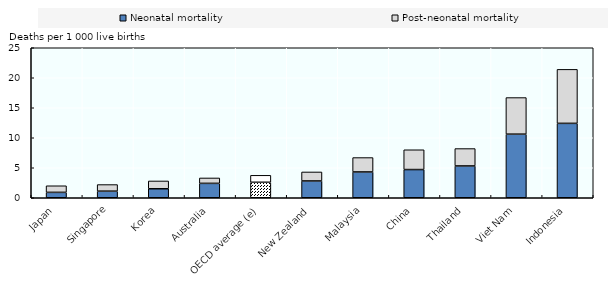
| Category | Neonatal mortality | Post-neonatal mortality |
|---|---|---|
| Japan | 0.9 | 1.1 |
| Singapore | 1.1 | 1.1 |
| Korea | 1.5 | 1.3 |
| Australia | 2.4 | 0.9 |
| OECD average (e) | 2.58 | 1.16 |
| New Zealand | 2.8 | 1.5 |
| Malaysia | 4.3 | 2.4 |
| China | 4.7 | 3.3 |
| Thailand | 5.3 | 2.9 |
| Viet Nam | 10.6 | 6.1 |
| Indonesia | 12.4 | 9 |